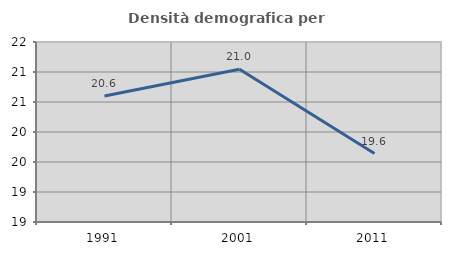
| Category | Densità demografica |
|---|---|
| 1991.0 | 20.599 |
| 2001.0 | 21.045 |
| 2011.0 | 19.641 |